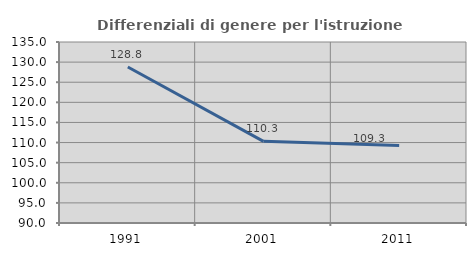
| Category | Differenziali di genere per l'istruzione superiore |
|---|---|
| 1991.0 | 128.79 |
| 2001.0 | 110.304 |
| 2011.0 | 109.298 |